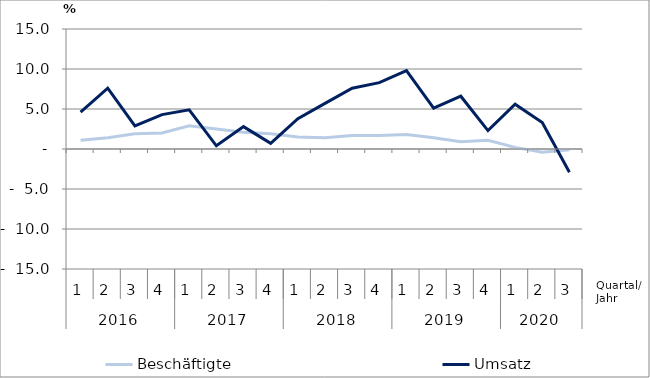
| Category | Beschäftigte | Umsatz |
|---|---|---|
| 0 | 1.1 | 4.6 |
| 1 | 1.4 | 7.6 |
| 2 | 1.9 | 2.9 |
| 3 | 2 | 4.3 |
| 4 | 2.9 | 4.9 |
| 5 | 2.5 | 0.4 |
| 6 | 2.1 | 2.8 |
| 7 | 1.9 | 0.7 |
| 8 | 1.5 | 3.8 |
| 9 | 1.4 | 5.7 |
| 10 | 1.7 | 7.6 |
| 11 | 1.7 | 8.3 |
| 12 | 1.8 | 9.8 |
| 13 | 1.4 | 5.1 |
| 14 | 0.9 | 6.6 |
| 15 | 1.1 | 2.3 |
| 16 | 0.2 | 5.6 |
| 17 | -0.4 | 3.3 |
| 18 | -0.1 | -2.9 |